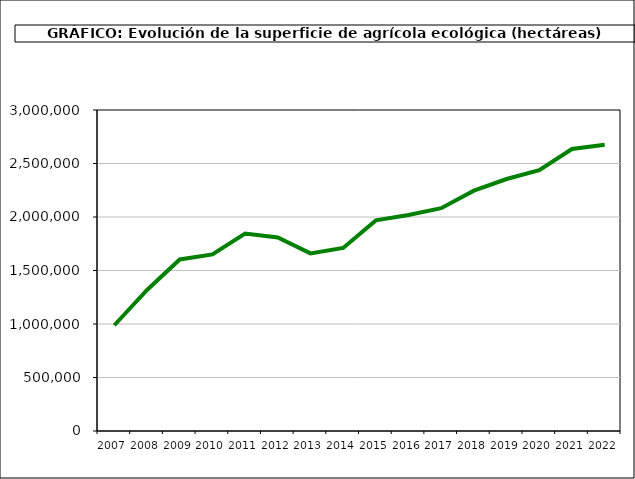
| Category | Superficie (ha) |
|---|---|
| 2007.0 | 988323 |
| 2008.0 | 1317752 |
| 2009.0 | 1602868 |
| 2010.0 | 1650866 |
| 2011.0 | 1845039 |
| 2012.0 | 1808492 |
| 2013.0 | 1659916 |
| 2014.0 | 1710493 |
| 2015.0 | 1968570 |
| 2016.0 | 2018802 |
| 2017.0 | 2082173 |
| 2018.0 | 2246475 |
| 2019.0 | 2354915.714 |
| 2020.0 | 2437891.017 |
| 2021.0 | 2635442 |
| 2022.0 | 2675331 |